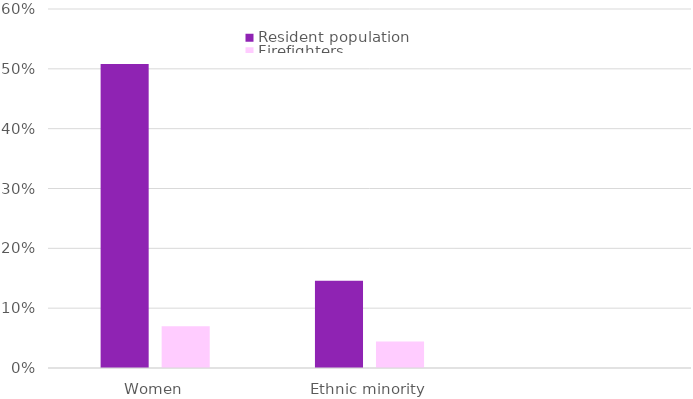
| Category | Resident population | Firefighters |
|---|---|---|
| Women | 0.508 | 0.07 |
| Ethnic minority | 0.146 | 0.044 |